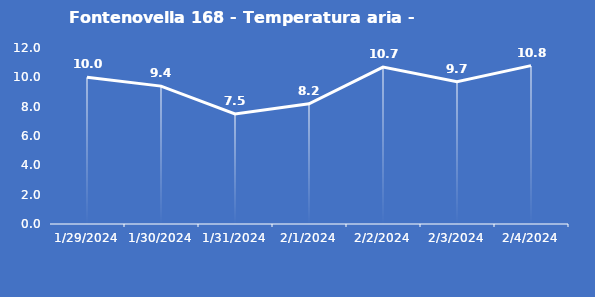
| Category | Fontenovella 168 - Temperatura aria - Grezzo (°C) |
|---|---|
| 1/29/24 | 10 |
| 1/30/24 | 9.4 |
| 1/31/24 | 7.5 |
| 2/1/24 | 8.2 |
| 2/2/24 | 10.7 |
| 2/3/24 | 9.7 |
| 2/4/24 | 10.8 |